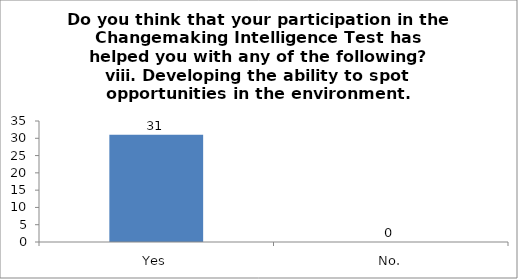
| Category | Do you think that your participation in the Changemaking Intelligence Test has helped you with any of the following?
viii. Developing the ability to spot opportunities in the environment. |
|---|---|
| Yes | 31 |
| No. | 0 |